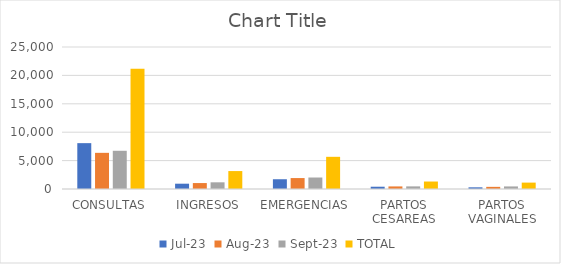
| Category | jul-23 | ago-23 | sep-23 | TOTAL |
|---|---|---|---|---|
| CONSULTAS | 8073 | 6366 | 6729 | 21168 |
| INGRESOS | 934 | 1046 | 1177 | 3157 |
| EMERGENCIAS | 1719 | 1925 | 2022 | 5666 |
| PARTOS CESAREAS | 402 | 453 | 461 | 1316 |
| PARTOS VAGINALES | 296 | 378 | 452 | 1126 |